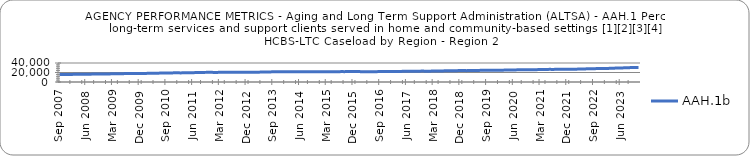
| Category | AAH.1b |
|---|---|
| 0.78378 | 15650 |
| 0.78567 | 15784 |
| 0.78719 | 15867 |
| 0.7887 | 15928 |
| 0.79022 | 16018 |
| 0.79129 | 16078 |
| 0.79193 | 16177 |
| 0.79455 | 16278 |
| 0.79439 | 16289 |
| 0.79457 | 16343 |
| 0.79632 | 16489 |
| 0.79721 | 16603 |
| 0.79865 | 16720 |
| 0.79917 | 16851 |
| 0.79965 | 16892 |
| 0.79991 | 16974 |
| 0.80036 | 17016 |
| 0.80119 | 17061 |
| 0.80135 | 17338 |
| 0.80196 | 17400 |
| 0.80282 | 17506 |
| 0.80375 | 17563 |
| 0.80441 | 17651 |
| 0.80454 | 17768 |
| 0.80574 | 17841 |
| 0.80717 | 17952 |
| 0.80907 | 18040 |
| 0.80996 | 18093 |
| 0.81048 | 18122 |
| 0.81132 | 18072 |
| 0.81235 | 18269 |
| 0.81422 | 18296 |
| 0.81521 | 18382 |
| 0.81511 | 18593 |
| 0.816 | 18746 |
| 0.81562 | 18871 |
| 0.8177 | 19001 |
| 0.81902 | 19149 |
| 0.81999 | 19186 |
| 0.8202 | 19254 |
| 0.82092 | 19225 |
| 0.82336 | 19191 |
| 0.82379 | 19418 |
| 0.82545 | 19546 |
| 0.82578 | 19636 |
| 0.82632 | 19727 |
| 0.82543 | 19743 |
| 0.82484 | 19953 |
| 0.82636 | 20000 |
| 0.82733 | 20255 |
| 0.82838 | 20278 |
| 0.82888 | 20359 |
| 0.82809 | 20192 |
| 0.82917 | 20183 |
| 0.82866 | 20367 |
| 0.82858 | 20434 |
| 0.82802 | 20540 |
| 0.82938 | 20624 |
| 0.83046 | 20624 |
| 0.83086 | 20684 |
| 0.83171 | 20621 |
| 0.83162 | 20697 |
| 0.83156 | 20631 |
| 0.8309 | 20627 |
| 0.83222 | 20636 |
| 0.83276 | 20545 |
| 0.83338 | 20653 |
| 0.83336 | 20731 |
| 0.83239 | 20859 |
| 0.83251 | 20802 |
| 0.8337 | 21234 |
| 0.83426 | 21296 |
| 0.83557 | 21355 |
| 0.83627 | 21394 |
| 0.83614 | 21424 |
| 0.83597 | 21419 |
| 0.83796 | 21495 |
| 0.83821 | 21416 |
| 0.83855 | 21771 |
| 0.84014 | 21500 |
| 0.83995 | 21491 |
| 0.84007 | 21483 |
| 0.8402 | 21429 |
| 0.841 | 21379 |
| 0.8424 | 21467 |
| 0.8431 | 21619 |
| 0.8435 | 21586 |
| 0.8439 | 21591 |
| 0.84383 | 21582 |
| 0.84463 | 21535 |
| 0.84443 | 21688 |
| 0.84487 | 21791 |
| 0.84543 | 21803 |
| 0.8466 | 21812 |
| 0.84682 | 21754 |
| 0.84816 | 21876 |
| 0.84589 | 21817 |
| 0.84646 | 21970 |
| 0.84772 | 21948 |
| 0.8486 | 21957 |
| 0.84786 | 21842 |
| 0.84849 | 21981 |
| 0.84851 | 21425 |
| 0.8492 | 21480 |
| 0.84852 | 21559 |
| 0.84989 | 21688 |
| 0.85076 | 21689 |
| 0.85196 | 21825 |
| 0.8534 | 21947 |
| 0.85355 | 22096 |
| 0.85326 | 22100 |
| 0.85294 | 22108 |
| 0.85119 | 22054 |
| 0.85152 | 22046 |
| 0.85143 | 22250 |
| 0.85182 | 22330 |
| 0.8521 | 22476 |
| 0.85264 | 22577 |
| 0.85441 | 22526 |
| 0.85526 | 22697 |
| 0.85728 | 22773 |
| 0.8577 | 22837 |
| 0.85845 | 22918 |
| 0.85828 | 22884 |
| 0.85799 | 22831 |
| 0.85772 | 22871 |
| 0.85887 | 23014 |
| 0.86116 | 23061 |
| 0.86123 | 23248 |
| 0.86193 | 23310 |
| 0.86372 | 23551 |
| 0.86147 | 23673 |
| 0.86303 | 23680 |
| 0.86431 | 23928 |
| 0.86533 | 23926 |
| 0.86473 | 24058 |
| 0.86411 | 24291 |
| 0.86504 | 23896 |
| 0.86518 | 24145 |
| 0.86641 | 24218 |
| 0.86717 | 24373 |
| 0.86792 | 24399 |
| 0.8694 | 24535 |
| 0.86921 | 24605 |
| 0.87375 | 24707 |
| 0.87927 | 24904 |
| 0.88196 | 24842 |
| 0.8826 | 24917 |
| 0.88378 | 24873 |
| 0.88511 | 24884 |
| 0.8857 | 25070 |
| 0.88923 | 25083 |
| 0.89424 | 25265 |
| 0.89466 | 25421 |
| 0.89512 | 25527 |
| 0.89475 | 25603 |
| 0.89525 | 25733 |
| 0.89485 | 25829 |
| 0.89346 | 25866 |
| 0.89386 | 26035 |
| 0.89048 | 25937 |
| 0.89013 | 26046 |
| 0.89185 | 26349 |
| 0.8934 | 26358 |
| 0.89298 | 26402 |
| 0.89372 | 26624 |
| 0.89661 | 26533 |
| 0.89824 | 26597 |
| 0.89708 | 26641 |
| 0.89662 | 26726 |
| 0.89759 | 26706 |
| 0.89814 | 26656 |
| 0.89823 | 26643 |
| 0.89819 | 26727 |
| 0.89789 | 27030 |
| 0.89829 | 27223 |
| 0.89874 | 27389 |
| 0.90061 | 27577 |
| 0.90125 | 27750 |
| 0.90115 | 27907 |
| 0.90196 | 28087 |
| 0.90133 | 28204 |
| 0.90135 | 28305 |
| 0.90118 | 28455 |
| 0.90219 | 28568 |
| 0.90296 | 28661 |
| 0.90356 | 29115 |
| 0.90607 | 29193 |
| 0.90755 | 29489 |
| 0.91023 | 29606 |
| nan | 29752 |
| nan | 30101 |
| nan | 30243 |
| nan | 30444 |
| nan | 30573 |
| nan | 30546 |